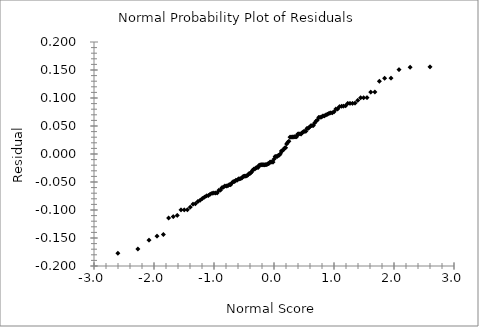
| Category | Series 0 |
|---|---|
| -2.600738782901967 | -0.177 |
| -2.269205796284967 | -0.17 |
| -2.0834601293053305 | -0.154 |
| -1.9501118371068618 | -0.147 |
| -1.8444589769601398 | -0.144 |
| -1.7561091829702185 | -0.114 |
| -1.6796611853158145 | -0.112 |
| -1.6119319708001063 | -0.11 |
| -1.550880882870382 | -0.1 |
| -1.495117724272355 | -0.1 |
| -1.4436508647839954 | -0.1 |
| -1.3957469929496678 | -0.095 |
| -1.3508478201523526 | -0.09 |
| -1.3085179969580212 | -0.089 |
| -1.268411147430669 | -0.085 |
| -1.230246929056721 | -0.083 |
| -1.1937950727831024 | -0.08 |
| -1.15886399304744 | -0.077 |
| -1.1252924776909854 | -0.075 |
| -1.0929435064589943 | -0.074 |
| -1.0616995735448178 | -0.072 |
| -1.0314590939212471 | -0.07 |
| -1.0021336044106617 | -0.07 |
| -0.9736455567605404 | -0.07 |
| -0.9459265580052854 | -0.07 |
| -0.9189159531498581 | -0.065 |
| -0.8925596729344509 | -0.064 |
| -0.8668092890842309 | -0.06 |
| -0.8416212335729143 | -0.059 |
| -0.8169561487217398 | -0.057 |
| -0.7927783425489394 | -0.057 |
| -0.7690553294512799 | -0.057 |
| -0.7457574405726279 | -0.055 |
| -0.7228574914691672 | -0.055 |
| -0.7003304971824915 | -0.052 |
| -0.6781534267711482 | -0.049 |
| -0.656304990866762 | -0.049 |
| -0.6347654570141967 | -0.047 |
| -0.6135164885015087 | -0.047 |
| -0.592541003140832 | -0.044 |
| -0.5718230490681815 | -0.044 |
| -0.5513476951205378 | -0.044 |
| -0.5311009337470696 | -0.042 |
| -0.5110695947369579 | -0.04 |
| -0.4912412683136057 | -0.04 |
| -0.47160423636559057 | -0.04 |
| -0.4521474107675362 | -0.039 |
| -0.4328602778962414 | -0.037 |
| -0.41373284857458725 | -0.035 |
| -0.3947556127824553 | -0.034 |
| -0.3759194985637552 | -0.032 |
| -0.35721583463458473 | -0.029 |
| -0.33863631626194146 | -0.027 |
| -0.32017297403713685 | -0.027 |
| -0.30181814521475947 | -0.025 |
| -0.2835644473279525 | -0.024 |
| -0.26540475382497564 | -0.024 |
| -0.24733217150142056 | -0.02 |
| -0.2293400195277115 | -0.02 |
| -0.21142180989331538 | -0.019 |
| -0.19357122910787328 | -0.019 |
| -0.17578212101566842 | -0.019 |
| -0.15804847059383903 | -0.019 |
| -0.14036438861680917 | -0.019 |
| -0.12272409707977236 | -0.019 |
| -0.10512191528297979 | -0.018 |
| -0.08755224648617962 | -0.017 |
| -0.07000956504899278 | -0.015 |
| -0.052488403978420264 | -0.014 |
| -0.034983342809147555 | -0.014 |
| -0.017488995745908814 | -0.014 |
| -1.392137635291833e-16 | -0.009 |
| 0.017488995745908814 | -0.004 |
| 0.03498334280914728 | -0.004 |
| 0.05248840397841999 | -0.004 |
| 0.0700095650489925 | -0.002 |
| 0.08755224648617937 | -0.002 |
| 0.10512191528297948 | 0 |
| 0.12272409707977208 | 0.005 |
| 0.14036438861680917 | 0.006 |
| 0.15804847059383875 | 0.008 |
| 0.17578212101566815 | 0.011 |
| 0.19357122910787328 | 0.011 |
| 0.21142180989331505 | 0.018 |
| 0.22934001952771127 | 0.021 |
| 0.24733217150142056 | 0.023 |
| 0.2654047538249753 | 0.03 |
| 0.2835644473279523 | 0.03 |
| 0.30181814521475947 | 0.03 |
| 0.3201729740371364 | 0.03 |
| 0.33863631626194124 | 0.031 |
| 0.3572158346345844 | 0.031 |
| 0.37591949856375484 | 0.031 |
| 0.3947556127824551 | 0.036 |
| 0.4137328485745868 | 0.036 |
| 0.4328602778962414 | 0.036 |
| 0.45214741076753584 | 0.036 |
| 0.47160423636559023 | 0.038 |
| 0.4912412683136057 | 0.04 |
| 0.5110695947369577 | 0.04 |
| 0.5311009337470691 | 0.041 |
| 0.5513476951205378 | 0.046 |
| 0.5718230490681813 | 0.046 |
| 0.5925410031408316 | 0.048 |
| 0.6135164885015087 | 0.05 |
| 0.6347654570141965 | 0.051 |
| 0.6563049908667613 | 0.051 |
| 0.6781534267711482 | 0.055 |
| 0.7003304971824911 | 0.059 |
| 0.7228574914691668 | 0.061 |
| 0.7457574405726279 | 0.065 |
| 0.7690553294512799 | 0.066 |
| 0.792778342548939 | 0.066 |
| 0.8169561487217396 | 0.068 |
| 0.8416212335729143 | 0.068 |
| 0.8668092890842305 | 0.07 |
| 0.8925596729344509 | 0.071 |
| 0.9189159531498581 | 0.073 |
| 0.9459265580052847 | 0.073 |
| 0.9736455567605402 | 0.074 |
| 1.0021336044106617 | 0.075 |
| 1.0314590939212467 | 0.08 |
| 1.0616995735448174 | 0.08 |
| 1.0929435064589943 | 0.085 |
| 1.1252924776909845 | 0.085 |
| 1.1588639930474396 | 0.085 |
| 1.1937950727831024 | 0.086 |
| 1.230246929056721 | 0.09 |
| 1.2684111474306685 | 0.09 |
| 1.3085179969580212 | 0.09 |
| 1.3508478201523526 | 0.091 |
| 1.3957469929496673 | 0.096 |
| 1.443650864783994 | 0.1 |
| 1.495117724272355 | 0.1 |
| 1.550880882870381 | 0.101 |
| 1.611931970800105 | 0.11 |
| 1.6796611853158145 | 0.111 |
| 1.7561091829702185 | 0.13 |
| 1.844458976960138 | 0.135 |
| 1.9501118371068618 | 0.136 |
| 2.0834601293053305 | 0.151 |
| 2.269205796284961 | 0.155 |
| 2.600738782901967 | 0.156 |